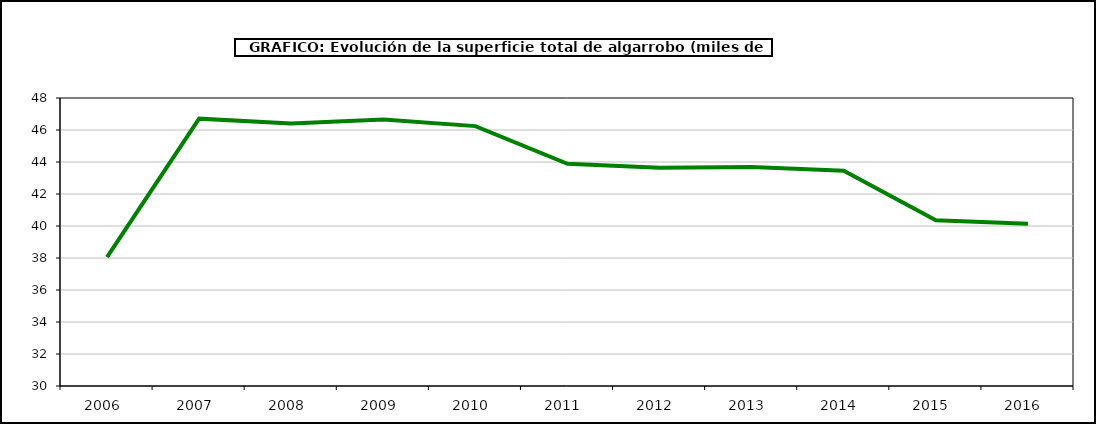
| Category | superficie |
|---|---|
| 2006.0 | 38.058 |
| 2007.0 | 46.708 |
| 2008.0 | 46.404 |
| 2009.0 | 46.656 |
| 2010.0 | 46.243 |
| 2011.0 | 43.883 |
| 2012.0 | 43.647 |
| 2013.0 | 43.695 |
| 2014.0 | 43.447 |
| 2015.0 | 40.353 |
| 2016.0 | 40.144 |